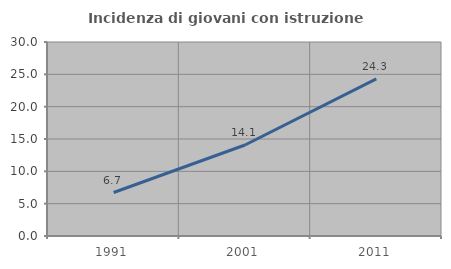
| Category | Incidenza di giovani con istruzione universitaria |
|---|---|
| 1991.0 | 6.726 |
| 2001.0 | 14.076 |
| 2011.0 | 24.306 |